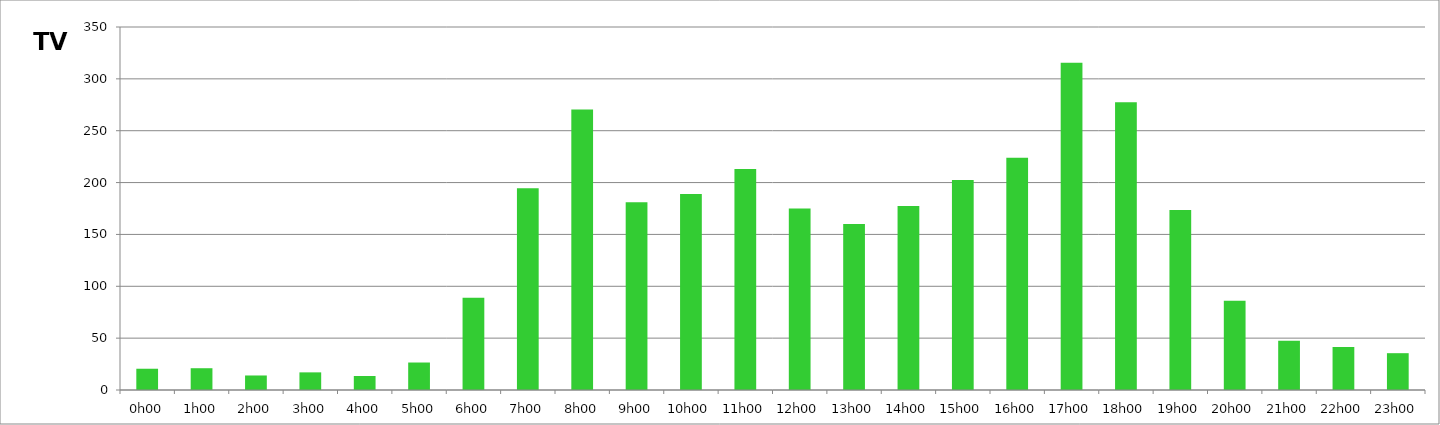
| Category | TV |
|---|---|
| 0.0 | 20.5 |
| 0.041666666666666664 | 21 |
| 0.08333333333333333 | 14 |
| 0.125 | 17 |
| 0.16666666666666666 | 13.5 |
| 0.20833333333333334 | 26.5 |
| 0.25 | 89 |
| 0.2916666666666667 | 194.5 |
| 0.3333333333333333 | 270.5 |
| 0.375 | 181 |
| 0.4166666666666667 | 189 |
| 0.4583333333333333 | 213 |
| 0.5 | 175 |
| 0.5416666666666666 | 160 |
| 0.5833333333333334 | 177.5 |
| 0.625 | 202.5 |
| 0.6666666666666666 | 224 |
| 0.7083333333333334 | 315.5 |
| 0.75 | 277.5 |
| 0.7916666666666666 | 173.5 |
| 0.8333333333333334 | 86 |
| 0.875 | 47.5 |
| 0.9166666666666666 | 41.5 |
| 0.9583333333333334 | 35.5 |